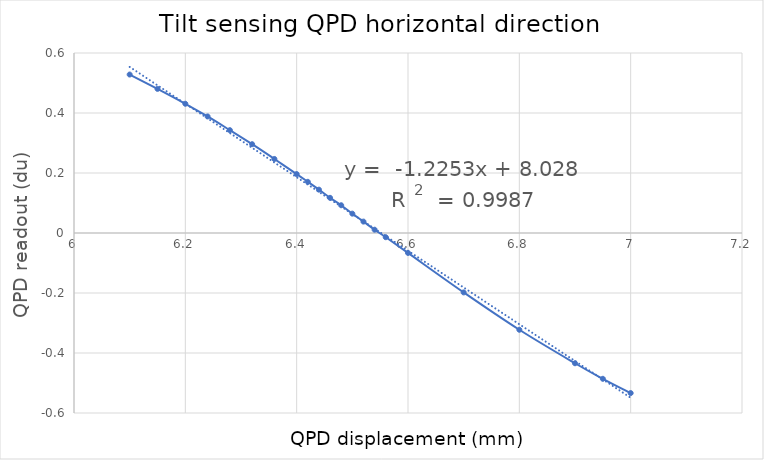
| Category | Series 0 |
|---|---|
| 6.1 | 0.528 |
| 6.15 | 0.48 |
| 6.2 | 0.431 |
| 6.24 | 0.388 |
| 6.28 | 0.343 |
| 6.32 | 0.296 |
| 6.36 | 0.247 |
| 6.4 | 0.196 |
| 6.42 | 0.171 |
| 6.44 | 0.144 |
| 6.46 | 0.117 |
| 6.48 | 0.092 |
| 6.5 | 0.064 |
| 6.52 | 0.038 |
| 6.54 | 0.011 |
| 6.56 | -0.014 |
| 6.6 | -0.066 |
| 6.7 | -0.198 |
| 6.8 | -0.322 |
| 6.9 | -0.434 |
| 6.95 | -0.486 |
| 7.0 | -0.534 |